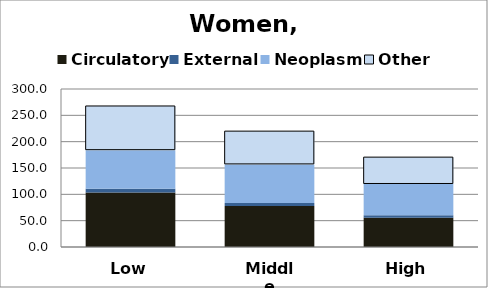
| Category | Circulatory | External | Neoplasm | Other |
|---|---|---|---|---|
| Low | 103.691 | 6.795 | 73.387 | 83.894 |
| Middle | 77.952 | 5.773 | 73.12 | 63.169 |
| High | 55.73 | 4.419 | 59.484 | 51.005 |